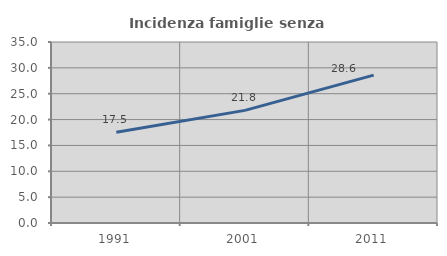
| Category | Incidenza famiglie senza nuclei |
|---|---|
| 1991.0 | 17.537 |
| 2001.0 | 21.779 |
| 2011.0 | 28.592 |